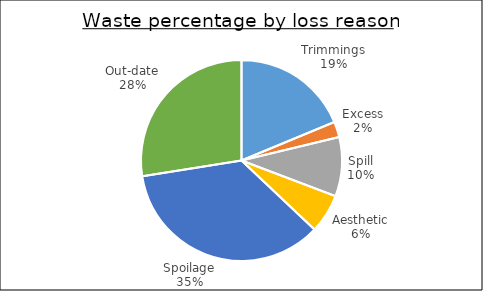
| Category | Series 0 |
|---|---|
| Trimmings | 1.73 |
| Excess | 0.23 |
| Spill | 0.88 |
| Aesthetic | 0.58 |
| Spoilage | 3.27 |
| Out-date | 2.54 |